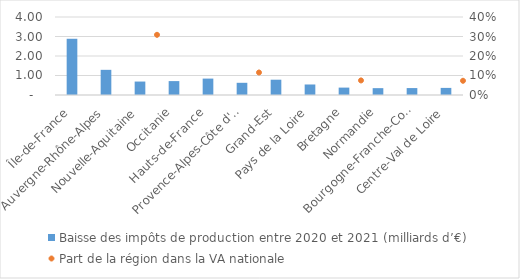
| Category | Baisse des impôts de production entre 2020 et 2021 (milliards d’€)  |
|---|---|
| Île-de-France | 2.883 |
| Auvergne-Rhône-Alpes | 1.29 |
| Nouvelle-Aquitaine | 0.69 |
| Occitanie | 0.713 |
| Hauts-de-France | 0.841 |
| Provence-Alpes-Côte d'Azur | 0.625 |
| Grand-Est | 0.784 |
| Pays de la Loire | 0.539 |
| Bretagne | 0.379 |
| Normandie | 0.351 |
| Bourgogne-Franche-Comté | 0.356 |
| Centre-Val de Loire | 0.364 |